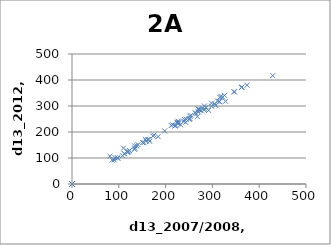
| Category | Series 0 |
|---|---|
| 347.0 | 354 |
| 81.0 | 107 |
| 243.0 | 237 |
| 270.0 | 277 |
| 374.0 | 380 |
| 322.0 | 334 |
| 0.0 | 0 |
| 307.0 | 302 |
| 198.0 | 204 |
| 252.0 | 252 |
| 292.0 | 283 |
| 252.0 | 261 |
| 110.0 | 138 |
| 166.0 | 164 |
| 164.0 | 171 |
| 315.0 | 318 |
| 316.0 | 333 |
| 276.0 | 282 |
| 240.0 | 248 |
| 232.0 | 228 |
| 298.0 | 311 |
| 228.0 | 236 |
| 123.0 | 129 |
| 227.0 | 242 |
| 305.0 | 308 |
| 141.0 | 151 |
| 346.0 | 355 |
| 92.0 | 101 |
| 272.0 | 285 |
| 138.0 | 147 |
| 222.0 | 225 |
| 283.0 | 300 |
| 315.0 | 316 |
| 286.0 | 294 |
| 220.0 | 223 |
| 269.0 | 289 |
| 326.0 | 341 |
| 429.0 | 417 |
| 328.0 | 318 |
| 225.0 | 238 |
| 157.0 | 172 |
| 362.0 | 371 |
| 154.0 | 159 |
| 244.0 | 249 |
| 268.0 | 259 |
| 212.0 | 225 |
| 215.0 | 228 |
| 265.0 | 271 |
| 254.0 | 264 |
| 0.0 | 0 |
| 0.0 | 0 |
| 363.0 | 373 |
| 0.0 | 0 |
| 282.0 | 285 |
| 298.0 | 299 |
| 274.0 | 284 |
| 225.0 | 234 |
| 251.0 | 251 |
| 284.0 | 288 |
| 311.0 | 319 |
| 318.0 | 337 |
| 120.0 | 123 |
| 239.0 | 241 |
| 263.0 | 274 |
| 175.0 | 188 |
| 173.0 | 184 |
| 0.0 | 0 |
| 0.0 | 0 |
| 151.0 | 159 |
| 112.0 | 116 |
| 184.0 | 182 |
| 250.0 | 249 |
| 0.0 | 0 |
| 227.0 | 233 |
| 158.0 | 165 |
| 134.0 | 133 |
| 162.0 | 171 |
| 271.0 | 288 |
| 134.0 | 146 |
| 108.0 | 109 |
| 121.0 | 126 |
| 112.0 | 117 |
| 86.0 | 92 |
| 134.0 | 138 |
| 90.0 | 93 |
| 97.0 | 101 |
| 98.0 | 99 |
| 118.0 | 122 |
| 0.0 | 0 |
| 0.0 | 0 |
| 0.0 | 0 |
| 0.0 | 0 |
| 0.0 | 0 |
| 0.0 | 0 |